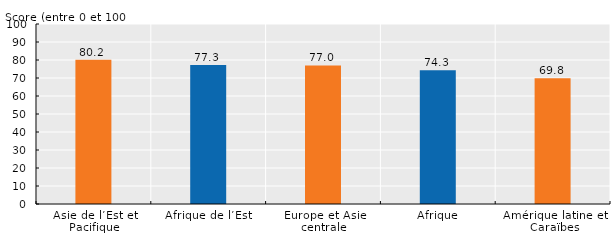
| Category | Moyenne de l’indice |
|---|---|
| Asie de l’Est et Pacifique | 80.156 |
| Afrique de l’Est | 77.267 |
| Europe et Asie centrale | 76.966 |
| Afrique | 74.338 |
| Amérique latine et Caraïbes | 69.822 |